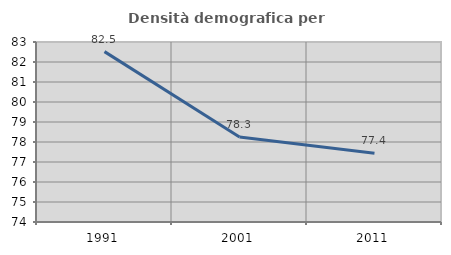
| Category | Densità demografica |
|---|---|
| 1991.0 | 82.519 |
| 2001.0 | 78.25 |
| 2011.0 | 77.434 |